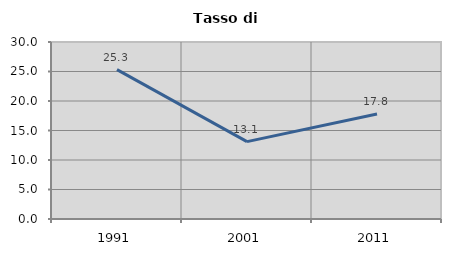
| Category | Tasso di disoccupazione   |
|---|---|
| 1991.0 | 25.327 |
| 2001.0 | 13.115 |
| 2011.0 | 17.784 |